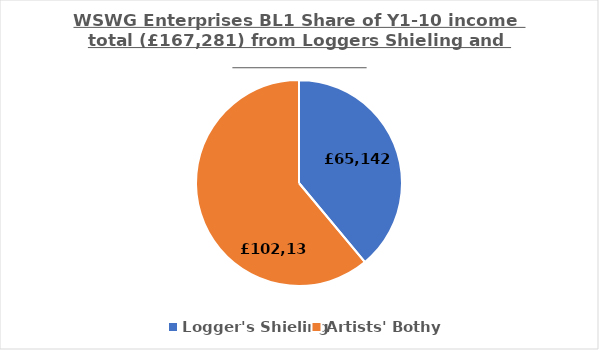
| Category | Series 0 |
|---|---|
| Logger's Shieling | 65142 |
| Artists' Bothy | 102138.8 |